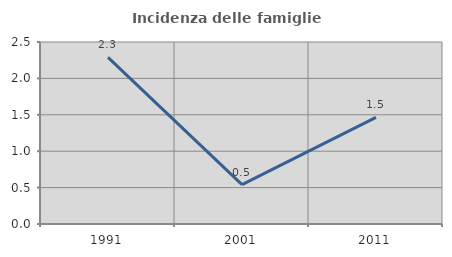
| Category | Incidenza delle famiglie numerose |
|---|---|
| 1991.0 | 2.288 |
| 2001.0 | 0.541 |
| 2011.0 | 1.466 |